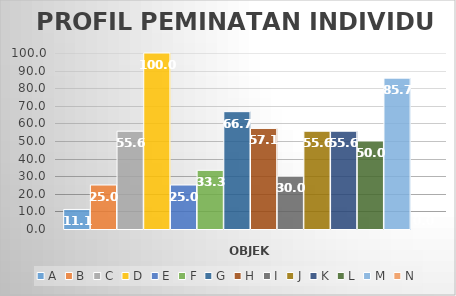
| Category | A | B | C | D | E | F | G | H | I | J | K | L | M | N |
|---|---|---|---|---|---|---|---|---|---|---|---|---|---|---|
| 0 | 11.111 | 25 | 55.556 | 100 | 25 | 33.333 | 66.667 | 57.143 | 30 | 55.556 | 55.556 | 50 | 85.714 | 0 |